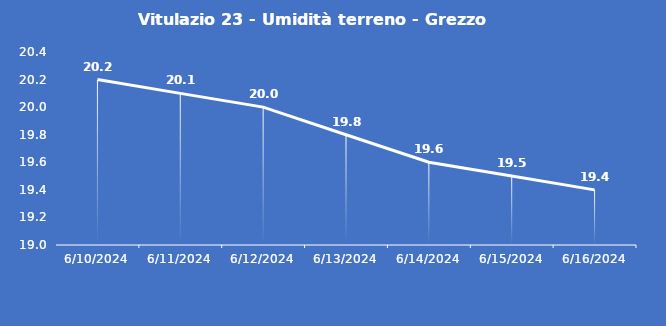
| Category | Vitulazio 23 - Umidità terreno - Grezzo (%VWC) |
|---|---|
| 6/10/24 | 20.2 |
| 6/11/24 | 20.1 |
| 6/12/24 | 20 |
| 6/13/24 | 19.8 |
| 6/14/24 | 19.6 |
| 6/15/24 | 19.5 |
| 6/16/24 | 19.4 |